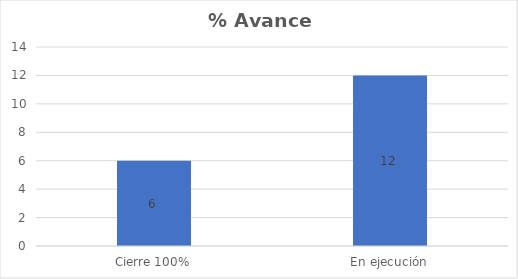
| Category | Series 0 |
|---|---|
| Cierre 100% | 6 |
| En ejecución | 12 |